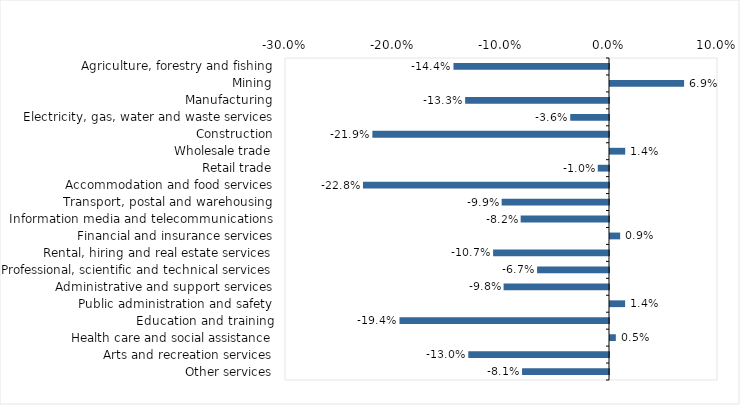
| Category | This week |
|---|---|
| Agriculture, forestry and fishing | -0.144 |
| Mining | 0.069 |
| Manufacturing | -0.133 |
| Electricity, gas, water and waste services | -0.036 |
| Construction | -0.219 |
| Wholesale trade | 0.014 |
| Retail trade | -0.01 |
| Accommodation and food services | -0.228 |
| Transport, postal and warehousing | -0.099 |
| Information media and telecommunications | -0.082 |
| Financial and insurance services | 0.009 |
| Rental, hiring and real estate services | -0.107 |
| Professional, scientific and technical services | -0.067 |
| Administrative and support services | -0.098 |
| Public administration and safety | 0.014 |
| Education and training | -0.194 |
| Health care and social assistance | 0.005 |
| Arts and recreation services | -0.13 |
| Other services | -0.08 |